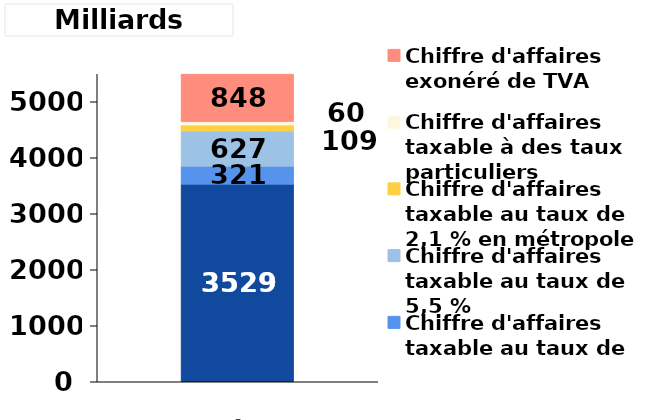
| Category | Chiffre d'affaires taxable au taux de 20 % | Chiffre d'affaires taxable au taux de 10 % | Chiffre d'affaires taxable au taux de 5,5 % | Chiffre d'affaires taxable au taux de 2,1 % en métropole | Chiffre d'affaires taxable à des taux particuliers | Chiffre d'affaires exonéré de TVA |
|---|---|---|---|---|---|---|
| 0 | 3529 | 321 | 627 | 109 | 60 | 848 |